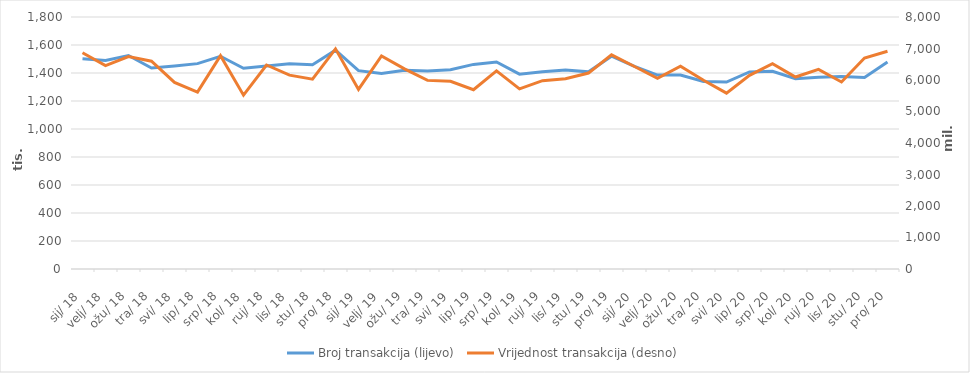
| Category | Broj transakcija (lijevo) |
|---|---|
| 2018-01-01 | 1502398 |
| 2018-02-01 | 1489855 |
| 2018-03-01 | 1524646 |
| 2018-04-01 | 1436023 |
| 2018-05-01 | 1449885 |
| 2018-06-01 | 1466953 |
| 2018-07-01 | 1519324 |
| 2018-08-01 | 1433717 |
| 2018-09-01 | 1449428 |
| 2018-10-01 | 1466266 |
| 2018-11-01 | 1459573 |
| 2018-12-01 | 1562846 |
| 2019-01-01 | 1416803 |
| 2019-02-01 | 1397120 |
| 2019-03-01 | 1420240 |
| 2019-04-01 | 1414147 |
| 2019-05-01 | 1423546 |
| 2019-06-01 | 1461385 |
| 2019-07-01 | 1478326 |
| 2019-08-01 | 1391864 |
| 2019-09-01 | 1408677 |
| 2019-10-01 | 1421421 |
| 2019-11-01 | 1408260 |
| 2019-12-01 | 1520353 |
| 2020-01-01 | 1447236 |
| 2020-02-01 | 1385305 |
| 2020-03-01 | 1385694 |
| 2020-04-01 | 1339386 |
| 2020-05-01 | 1334897 |
| 2020-06-01 | 1407526 |
| 2020-07-01 | 1412474 |
| 2020-08-01 | 1359067 |
| 2020-09-01 | 1369059 |
| 2020-10-01 | 1375170 |
| 2020-11-01 | 1367898 |
| 2020-12-01 | 1478546 |